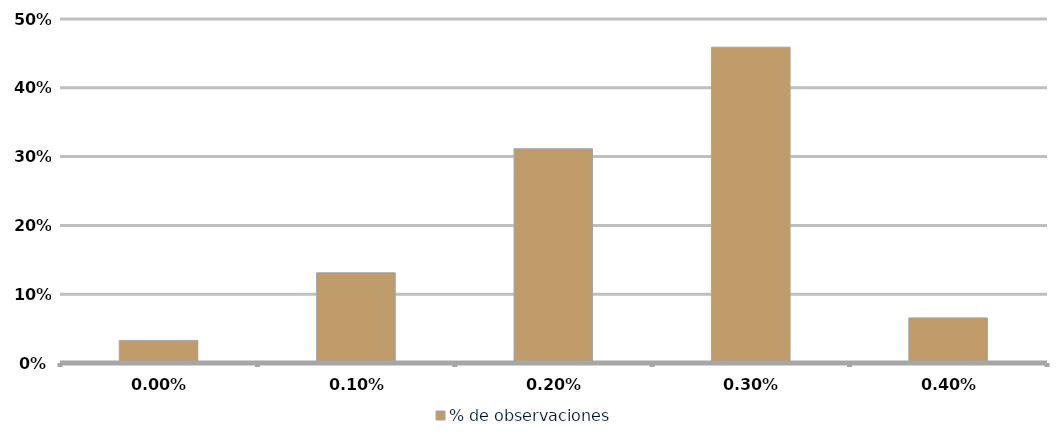
| Category | % de observaciones  |
|---|---|
| 0.0 | 0.033 |
| 0.001 | 0.131 |
| 0.002 | 0.311 |
| 0.003 | 0.459 |
| 0.004 | 0.066 |